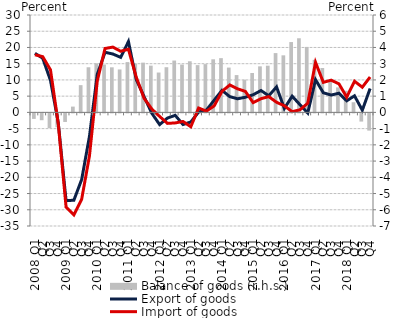
| Category | Balance of goods (r.h.s.) |
|---|---|
| 2008. I. | -0.339 |
|          II. | -0.422 |
|          III. | -0.907 |
|          IV. | -0.854 |
| 2009. I. | -0.529 |
|          II. | 0.357 |
|          III. | 1.679 |
|          IV. | 2.781 |
| 2010. I. | 3.022 |
|          II. | 2.95 |
|          III. | 2.777 |
|          IV. | 2.645 |
| 2011. I. | 3.099 |
|          II. | 3.007 |
|          III. | 3.065 |
|          IV. | 2.881 |
| 2012. I. | 2.455 |
|          II. | 2.783 |
|          III. | 3.194 |
|          IV. | 2.946 |
| 2013. I. | 3.15 |
| II. | 2.912 |
|          III. | 2.974 |
| IV. | 3.271 |
| 2014. I. | 3.342 |
| II. | 2.761 |
|          III. | 2.298 |
| IV. | 2.013 |
| 2015. I. | 2.427 |
| II. | 2.836 |
|          III. | 2.878 |
| IV. | 3.653 |
| 2016. I. | 3.515 |
| II. | 4.333 |
|          III. | 4.567 |
| IV. | 4.032 |
| 2017. I. | 3.237 |
| II. | 2.736 |
|          III. | 2.003 |
| IV. | 1.539 |
| 2018. I. | 1.333 |
| II. | 0.626 |
|          III. | -0.505 |
| IV. | -1.061 |